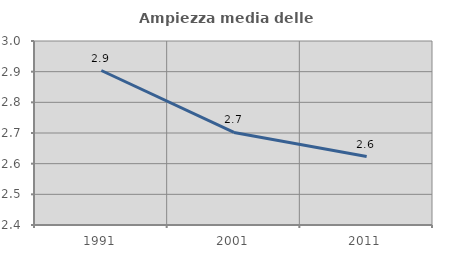
| Category | Ampiezza media delle famiglie |
|---|---|
| 1991.0 | 2.904 |
| 2001.0 | 2.702 |
| 2011.0 | 2.623 |